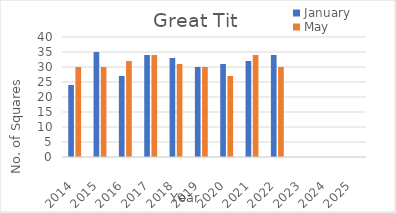
| Category | January | May |
|---|---|---|
| 2014.0 | 24 | 30 |
| 2015.0 | 35 | 30 |
| 2016.0 | 27 | 32 |
| 2017.0 | 34 | 34 |
| 2018.0 | 33 | 31 |
| 2019.0 | 30 | 30 |
| 2020.0 | 31 | 27 |
| 2021.0 | 32 | 34 |
| 2022.0 | 34 | 30 |
| 2023.0 | 0 | 0 |
| 2024.0 | 0 | 0 |
| 2025.0 | 0 | 0 |